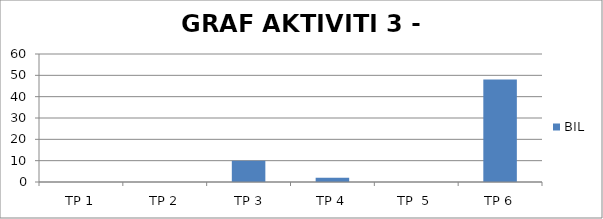
| Category | BIL |
|---|---|
| TP 1 | 0 |
| TP 2 | 0 |
|  TP 3 | 10 |
| TP 4 | 2 |
| TP  5 | 0 |
| TP 6 | 48 |